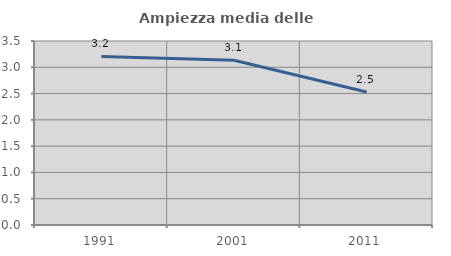
| Category | Ampiezza media delle famiglie |
|---|---|
| 1991.0 | 3.205 |
| 2001.0 | 3.134 |
| 2011.0 | 2.531 |